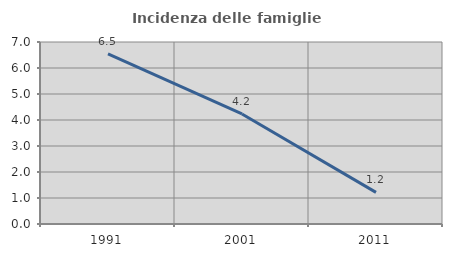
| Category | Incidenza delle famiglie numerose |
|---|---|
| 1991.0 | 6.546 |
| 2001.0 | 4.231 |
| 2011.0 | 1.217 |